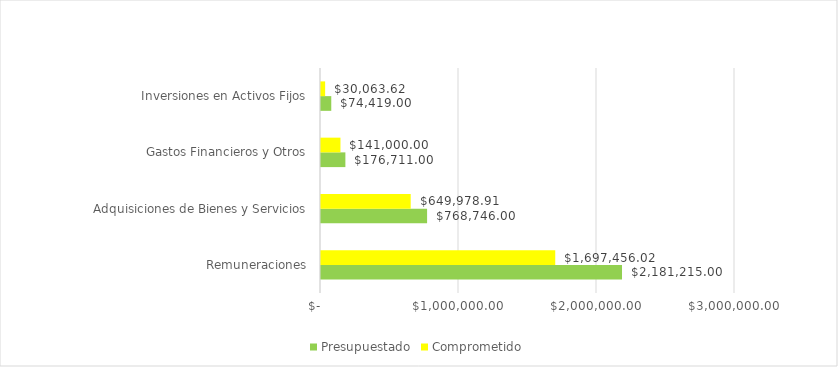
| Category |  Presupuestado  |  Comprometido  |
|---|---|---|
| Remuneraciones | 2181215 | 1697456.02 |
| Adquisiciones de Bienes y Servicios | 768746 | 649978.91 |
| Gastos Financieros y Otros | 176711 | 141000 |
| Inversiones en Activos Fijos | 74419 | 30063.62 |